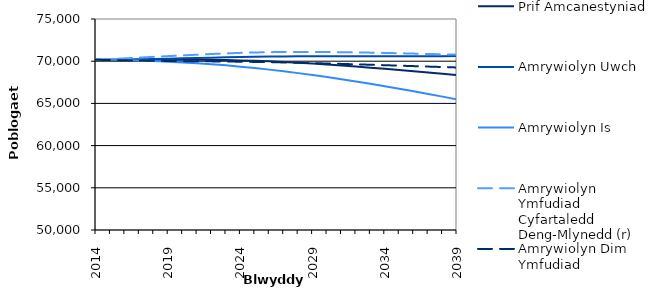
| Category | Prif Amcanestyniad | Amrywiolyn Uwch | Amrywiolyn Is | Amrywiolyn Ymfudiad Cyfartaledd Deng-Mlynedd (r) | Amrywiolyn Dim Ymfudiad |
|---|---|---|---|---|---|
| 2014.0 | 70169 | 70169 | 70169 | 70169 | 70169 |
| 2015.0 | 70165.47 | 70165.47 | 70165.47 | 70248.154 | 70131.08 |
| 2016.0 | 70170.04 | 70194.998 | 70128.994 | 70336.935 | 70102.761 |
| 2017.0 | 70176.044 | 70229.016 | 70082.825 | 70428.643 | 70079.915 |
| 2018.0 | 70174.98 | 70261.091 | 70019.591 | 70514.611 | 70053.725 |
| 2019.0 | 70173.824 | 70297.557 | 69946.131 | 70601.836 | 70031.408 |
| 2020.0 | 70169.169 | 70335.125 | 69858.367 | 70687.045 | 70010.761 |
| 2021.0 | 70161.58 | 70375.658 | 69756.884 | 70770.866 | 69994.191 |
| 2022.0 | 70149.202 | 70416.148 | 69639.953 | 70851.423 | 69979.668 |
| 2023.0 | 70128.534 | 70454.669 | 69507.107 | 70925.112 | 69963.487 |
| 2024.0 | 70093.784 | 70488.919 | 69355.079 | 70985.887 | 69940.884 |
| 2025.0 | 70045.411 | 70521.341 | 69186.079 | 71034.084 | 69914.715 |
| 2026.0 | 69983.675 | 70550.025 | 69002.038 | 71069.705 | 69885.919 |
| 2027.0 | 69907.707 | 70570.712 | 68802.415 | 71091.696 | 69853.24 |
| 2028.0 | 69819.01 | 70583.867 | 68587.779 | 71101.54 | 69816.598 |
| 2029.0 | 69718.371 | 70590.239 | 68358.233 | 71099.987 | 69774.824 |
| 2030.0 | 69607.062 | 70591.237 | 68114.952 | 71088.363 | 69728.339 |
| 2031.0 | 69487.6 | 70588.779 | 67859.86 | 71069.212 | 69679.037 |
| 2032.0 | 69361.501 | 70585.165 | 67594.725 | 71044.154 | 69628.815 |
| 2033.0 | 69230.779 | 70582.299 | 67320.663 | 71015.375 | 69579.827 |
| 2034.0 | 69092.885 | 70577.919 | 67034.537 | 70980.422 | 69526.977 |
| 2035.0 | 68950.119 | 70575.09 | 66739.084 | 70941.842 | 69472.214 |
| 2036.0 | 68803.002 | 70575.493 | 66435.03 | 70900.388 | 69416.436 |
| 2037.0 | 68654.069 | 70582.405 | 66125.087 | 70858.85 | 69362.366 |
| 2038.0 | 68501.707 | 70592.212 | 65804.569 | 70815.771 | 69308.752 |
| 2039.0 | 68348.411 | 70607.982 | 65476.86 | 70773.864 | 69258.345 |